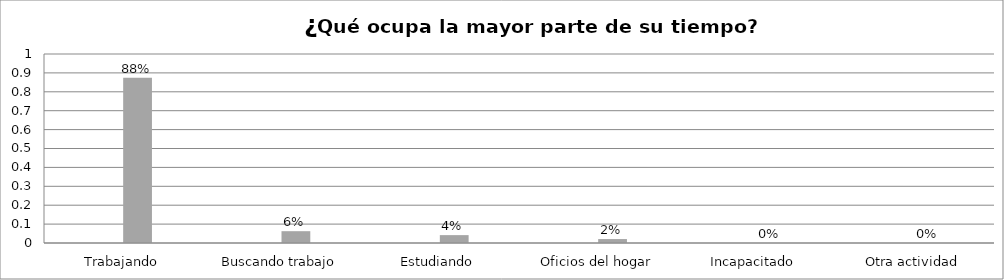
| Category | Series 0 | Series 1 | Series 2 | Series 3 |
|---|---|---|---|---|
| Trabajando |  |  | 0.875 |  |
| Buscando trabajo |  |  | 0.062 |  |
| Estudiando |  |  | 0.042 |  |
| Oficios del hogar |  |  | 0.021 |  |
| Incapacitado  |  |  | 0 |  |
| Otra actividad |  |  | 0 |  |